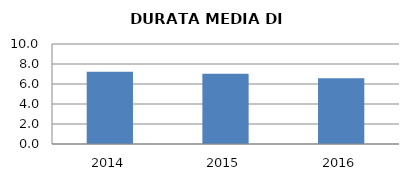
| Category | 2014 2015 2016 |
|---|---|
| 2014.0 | 7.22 |
| 2015.0 | 7.018 |
| 2016.0 | 6.582 |